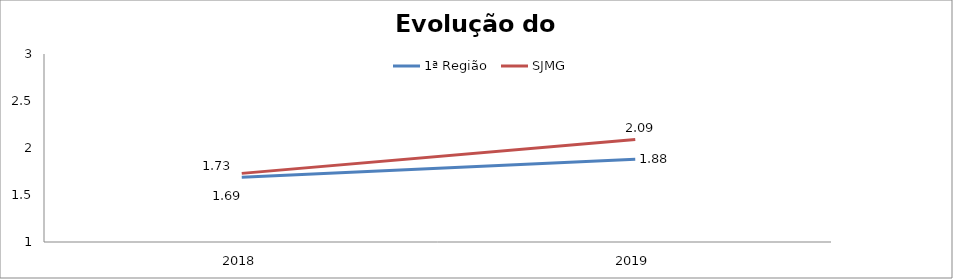
| Category | 1ª Região | SJMG |
|---|---|---|
| 0 | 1.69 | 1.73 |
| 1 | 1.88 | 2.09 |